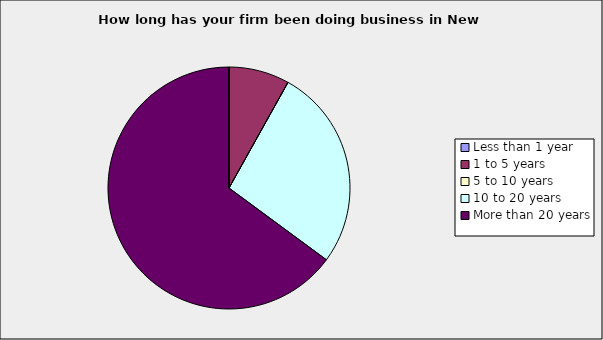
| Category | Series 0 |
|---|---|
| Less than 1 year | 0 |
| 1 to 5 years | 0.081 |
| 5 to 10 years | 0 |
| 10 to 20 years | 0.27 |
| More than 20 years | 0.649 |